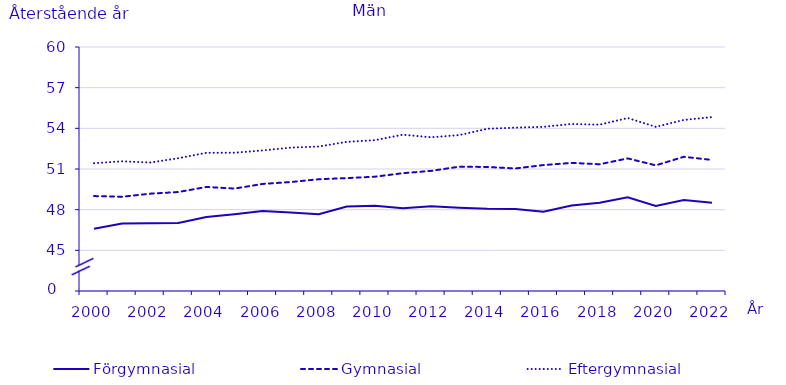
| Category | Förgymnasial | Gymnasial | Eftergymnasial |
|---|---|---|---|
| 2000.0 | 46.586 | 49.003 | 51.43 |
| 2001.0 | 46.977 | 48.953 | 51.567 |
| 2002.0 | 46.995 | 49.18 | 51.479 |
| 2003.0 | 47.018 | 49.302 | 51.794 |
| 2004.0 | 47.454 | 49.674 | 52.195 |
| 2005.0 | 47.656 | 49.557 | 52.202 |
| 2006.0 | 47.893 | 49.898 | 52.369 |
| 2007.0 | 47.79 | 50.037 | 52.577 |
| 2008.0 | 47.664 | 50.246 | 52.658 |
| 2009.0 | 48.231 | 50.328 | 53.005 |
| 2010.0 | 48.297 | 50.433 | 53.127 |
| 2011.0 | 48.107 | 50.692 | 53.534 |
| 2012.0 | 48.25 | 50.86 | 53.34 |
| 2013.0 | 48.14 | 51.17 | 53.5 |
| 2014.0 | 48.06 | 51.15 | 53.97 |
| 2015.0 | 48.05 | 51.04 | 54.05 |
| 2016.0 | 47.84 | 51.29 | 54.11 |
| 2017.0 | 48.3 | 51.45 | 54.32 |
| 2018.0 | 48.51 | 51.35 | 54.27 |
| 2019.0 | 48.92 | 51.78 | 54.76 |
| 2020.0 | 48.28 | 51.27 | 54.11 |
| 2021.0 | 48.71 | 51.9 | 54.62 |
| 2022.0 | 48.51 | 51.67 | 54.83 |